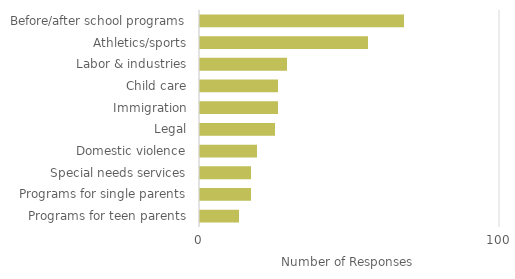
| Category | Satisfied with services |
|---|---|
| Programs for teen parents | 13 |
| Programs for single parents | 17 |
| Special needs services | 17 |
| Domestic violence | 19 |
| Legal | 25 |
| Immigration | 26 |
| Child care | 26 |
| Labor & industries | 29 |
| Athletics/sports | 56 |
| Before/after school programs | 68 |